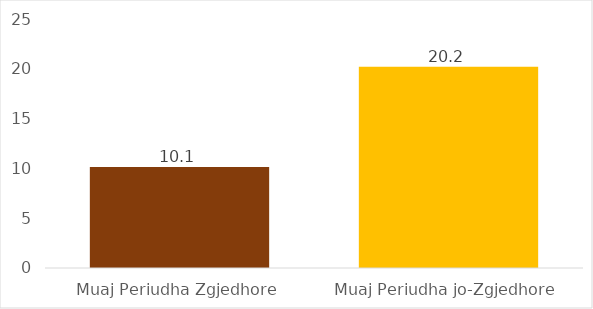
| Category | Mesatarisht Pagesa për Muaj |
|---|---|
| Muaj Periudha Zgjedhore | 10.134 |
| Muaj Periudha jo-Zgjedhore | 20.207 |